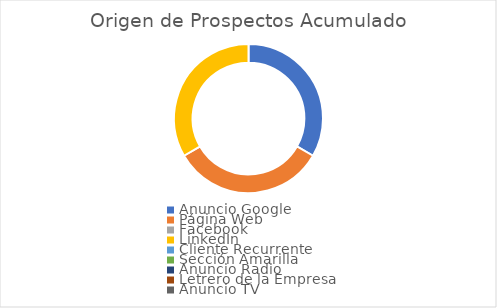
| Category | Series 0 |
|---|---|
| Anuncio Google | 1 |
| Página Web | 1 |
| Facebook | 0 |
| LinkedIn | 1 |
| Cliente Recurrente | 0 |
| Sección Amarilla | 0 |
| Anuncio Radio | 0 |
| Letrero de la Empresa | 0 |
| Anuncio TV | 0 |